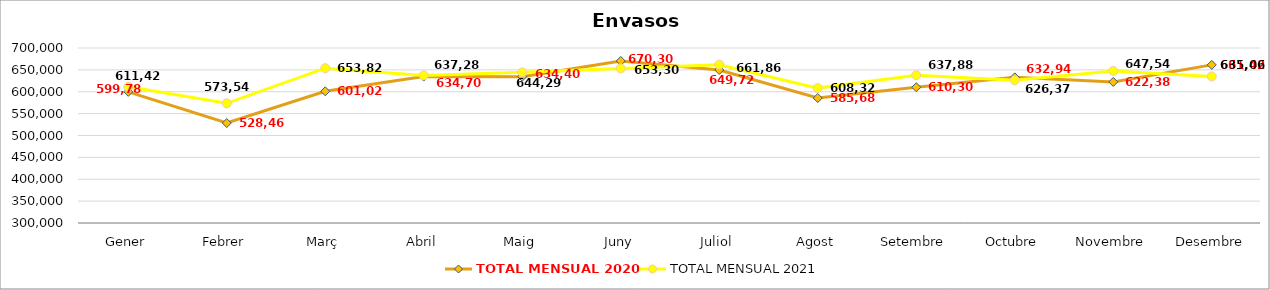
| Category | TOTAL MENSUAL 2020 | TOTAL MENSUAL 2021 |
|---|---|---|
| Gener | 599779.98 | 611420 |
| Febrer | 528459.97 | 573540 |
| Març | 601020 | 653820.03 |
| Abril | 634699.98 | 637280.01 |
| Maig | 634400.02 | 644292.02 |
| Juny | 670300.02 | 653300 |
| Juliol | 649720.17 | 661860 |
| Agost | 585680.02 | 608320.02 |
| Setembre | 610300.01 | 637879.99 |
| Octubre | 632939.99 | 626370 |
| Novembre | 622380.02 | 647540.02 |
| Desembre | 661420.01 | 635061 |